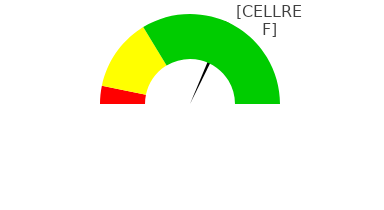
| Category | pointer |
|---|---|
| 0 | 62.609 |
| 1 | 2 |
| 2 | 135.391 |